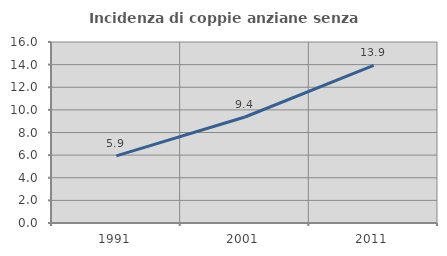
| Category | Incidenza di coppie anziane senza figli  |
|---|---|
| 1991.0 | 5.938 |
| 2001.0 | 9.37 |
| 2011.0 | 13.936 |